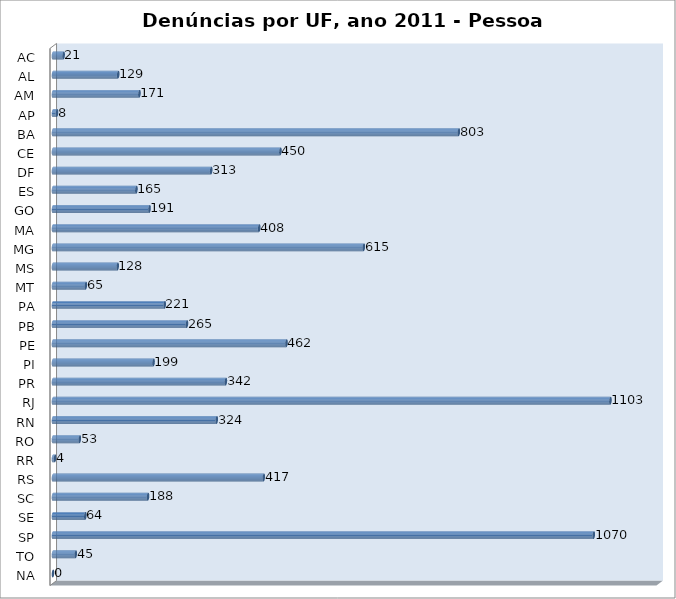
| Category | Series 0 |
|---|---|
| AC | 21 |
| AL | 129 |
| AM | 171 |
| AP | 8 |
| BA | 803 |
| CE | 450 |
| DF | 313 |
| ES | 165 |
| GO | 191 |
| MA | 408 |
| MG | 615 |
| MS | 128 |
| MT | 65 |
| PA | 221 |
| PB | 265 |
| PE | 462 |
| PI | 199 |
| PR | 342 |
| RJ | 1103 |
| RN | 324 |
| RO | 53 |
| RR | 4 |
| RS | 417 |
| SC | 188 |
| SE | 64 |
| SP | 1070 |
| TO | 45 |
| NA | 0 |